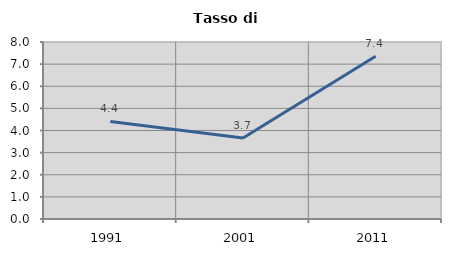
| Category | Tasso di disoccupazione   |
|---|---|
| 1991.0 | 4.407 |
| 2001.0 | 3.658 |
| 2011.0 | 7.358 |